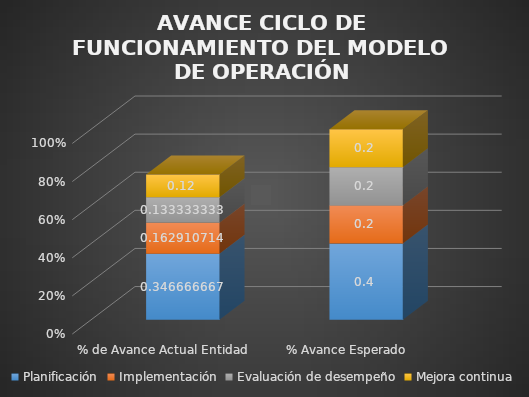
| Category | Planificación | Implementación | Evaluación de desempeño | Mejora continua |
|---|---|---|---|---|
| % de Avance Actual Entidad | 0.347 | 0.163 | 0.133 | 0.12 |
| % Avance Esperado | 0.4 | 0.2 | 0.2 | 0.2 |